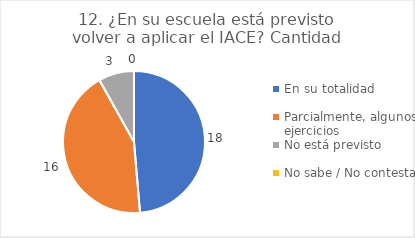
| Category | 12. ¿En su escuela está previsto volver a aplicar el IACE? |
|---|---|
| En su totalidad  | 0.486 |
| Parcialmente, algunos ejercicios  | 0.432 |
| No está previsto  | 0.081 |
| No sabe / No contesta | 0 |